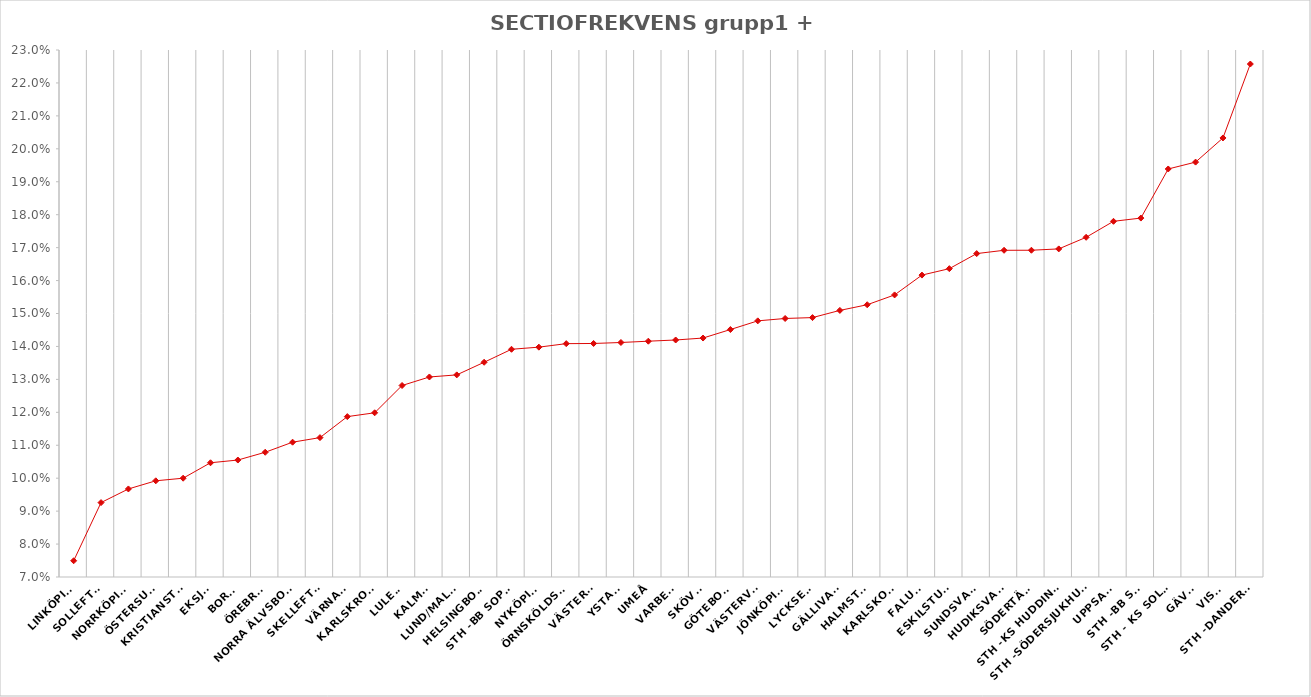
| Category | Series 0 |
|---|---|
| Linköping | 0.075 |
| Sollefteå | 0.093 |
| Norrköping | 0.097 |
| Östersund | 0.099 |
| Kristianstad | 0.1 |
| Eksjö | 0.105 |
| Borås | 0.106 |
| Örebro | 0.108 |
| Norra Älvsborg | 0.111 |
| Skellefteå | 0.112 |
| Värnamo | 0.119 |
| Karlskrona | 0.12 |
| Luleå | 0.128 |
| Kalmar | 0.131 |
| Lund/Malmö | 0.131 |
| Helsingborg | 0.135 |
| Sth -BB Sophia | 0.139 |
| Nyköping | 0.14 |
| Örnsköldsvik | 0.141 |
| Västerås | 0.141 |
| Ystad | 0.141 |
| Umeå | 0.142 |
| Varberg | 0.142 |
| Skövde | 0.143 |
| Göteborg | 0.145 |
| Västervik | 0.148 |
| Jönköping | 0.148 |
| Lycksele | 0.149 |
| Gällivare | 0.151 |
| Halmstad | 0.153 |
| Karlskoga | 0.156 |
| Falun | 0.162 |
| Eskilstuna | 0.164 |
| Sundsvall | 0.168 |
| Hudiksvall | 0.169 |
| Södertälje | 0.169 |
| Sth -KS Huddinge | 0.17 |
| Sth -Södersjukhuset | 0.173 |
| Uppsala | 0.178 |
| Sth -BB Sth | 0.179 |
| Sth - KS Solna | 0.194 |
| Gävle | 0.196 |
| Visby | 0.203 |
| Sth -Danderyd | 0.226 |